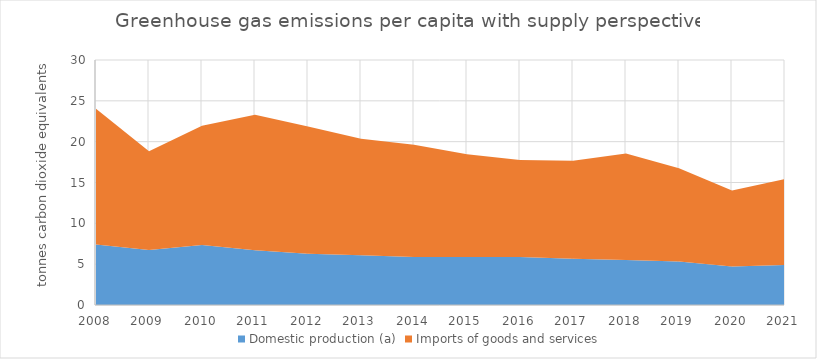
| Category | Domestic production (a) | Imports of goods and services |
|---|---|---|
| 2008.0 | 7.396 | 16.632 |
| 2009.0 | 6.733 | 12.102 |
| 2010.0 | 7.335 | 14.623 |
| 2011.0 | 6.706 | 16.587 |
| 2012.0 | 6.286 | 15.575 |
| 2013.0 | 6.08 | 14.269 |
| 2014.0 | 5.869 | 13.743 |
| 2015.0 | 5.864 | 12.58 |
| 2016.0 | 5.874 | 11.877 |
| 2017.0 | 5.649 | 12.02 |
| 2018.0 | 5.501 | 13.049 |
| 2019.0 | 5.32 | 11.421 |
| 2020.0 | 4.727 | 9.296 |
| 2021.0 | 4.899 | 10.538 |